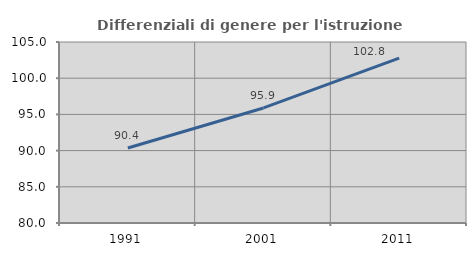
| Category | Differenziali di genere per l'istruzione superiore |
|---|---|
| 1991.0 | 90.357 |
| 2001.0 | 95.89 |
| 2011.0 | 102.772 |